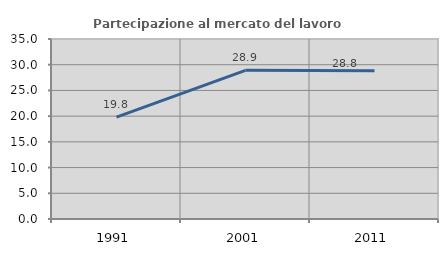
| Category | Partecipazione al mercato del lavoro  femminile |
|---|---|
| 1991.0 | 19.821 |
| 2001.0 | 28.911 |
| 2011.0 | 28.821 |